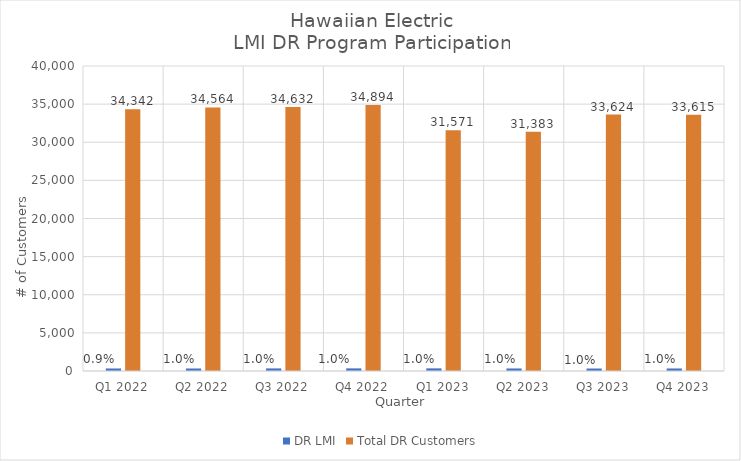
| Category | DR LMI | Total DR Customers |
|---|---|---|
| Q1 2022 | 331 | 34342 |
| Q2 2022 | 329 | 34564 |
| Q3 2022 | 340 | 34632 |
| Q4 2022 | 344 | 34894 |
| Q1 2023 | 346 | 31571 |
| Q2 2023 | 333 | 31383 |
| Q3 2023 | 326 | 33624 |
| Q4 2023 | 332 | 33615 |